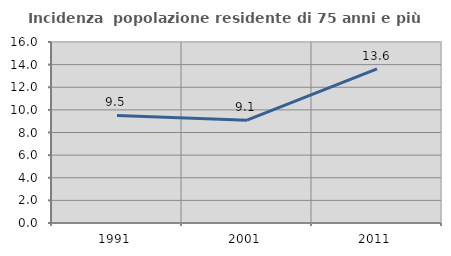
| Category | Incidenza  popolazione residente di 75 anni e più |
|---|---|
| 1991.0 | 9.508 |
| 2001.0 | 9.091 |
| 2011.0 | 13.628 |